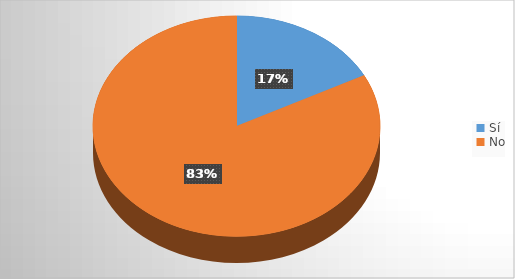
| Category | Series 0 |
|---|---|
| Sí | 41 |
| No | 195 |